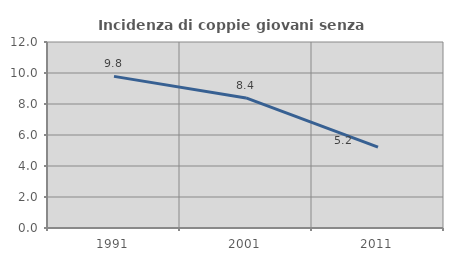
| Category | Incidenza di coppie giovani senza figli |
|---|---|
| 1991.0 | 9.783 |
| 2001.0 | 8.392 |
| 2011.0 | 5.216 |